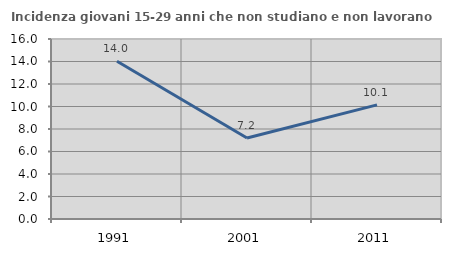
| Category | Incidenza giovani 15-29 anni che non studiano e non lavorano  |
|---|---|
| 1991.0 | 14.021 |
| 2001.0 | 7.205 |
| 2011.0 | 10.149 |